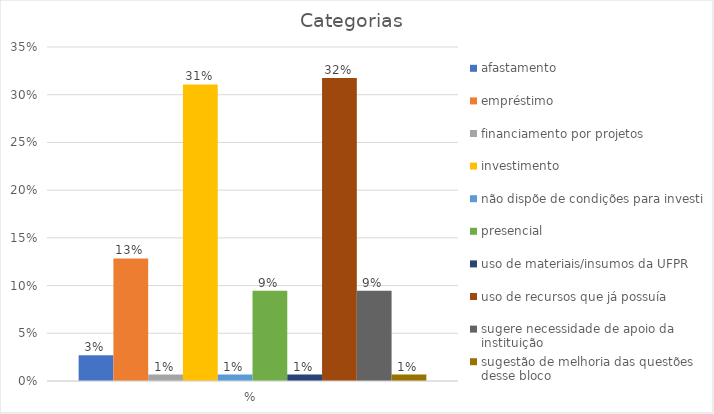
| Category | afastamento | empréstimo | financiamento por projetos | investimento | não dispõe de condições para investir | presencial | uso de materiais/insumos da UFPR | uso de recursos que já possuía | sugere necessidade de apoio da instituição  | sugestão de melhoria das questões desse bloco |
|---|---|---|---|---|---|---|---|---|---|---|
| % | 0.027 | 0.128 | 0.007 | 0.311 | 0.007 | 0.095 | 0.007 | 0.318 | 0.095 | 0.007 |